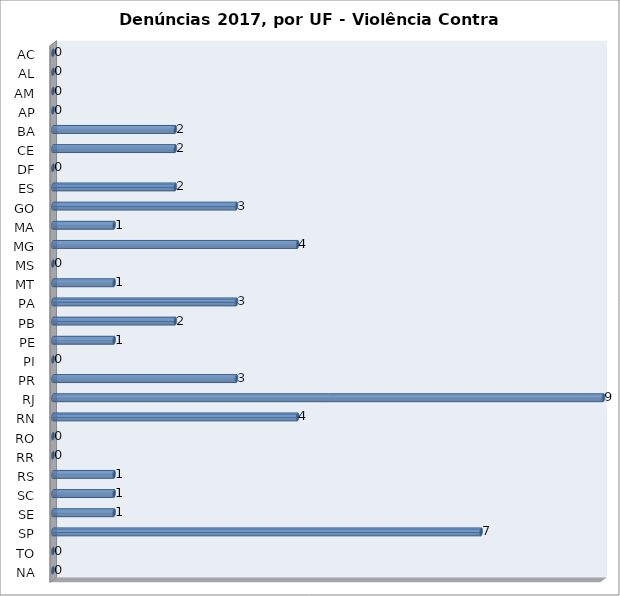
| Category | Series 0 |
|---|---|
| AC | 0 |
| AL | 0 |
| AM | 0 |
| AP | 0 |
| BA | 2 |
| CE | 2 |
| DF | 0 |
| ES | 2 |
| GO | 3 |
| MA | 1 |
| MG | 4 |
| MS | 0 |
| MT | 1 |
| PA | 3 |
| PB | 2 |
| PE | 1 |
| PI | 0 |
| PR | 3 |
| RJ | 9 |
| RN | 4 |
| RO | 0 |
| RR | 0 |
| RS | 1 |
| SC | 1 |
| SE | 1 |
| SP | 7 |
| TO | 0 |
| NA | 0 |